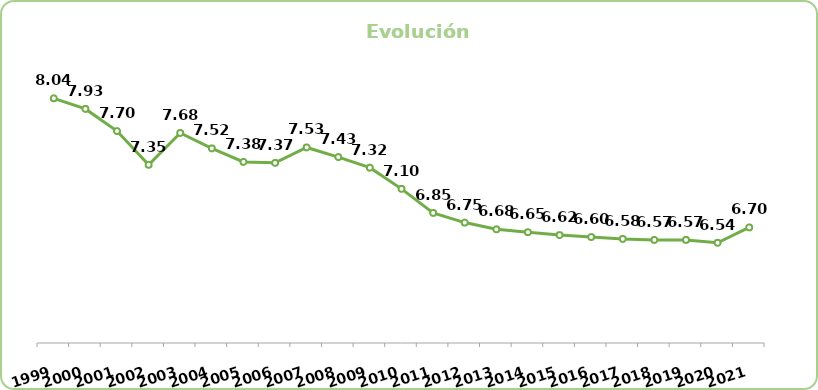
| Category | Series 0 |
|---|---|
| 1999.0 | 8.04 |
| 2000.0 | 7.93 |
| 2001.0 | 7.7 |
| 2002.0 | 7.35 |
| 2003.0 | 7.68 |
| 2004.0 | 7.52 |
| 2005.0 | 7.38 |
| 2006.0 | 7.37 |
| 2007.0 | 7.53 |
| 2008.0 | 7.43 |
| 2009.0 | 7.32 |
| 2010.0 | 7.1 |
| 2011.0 | 6.85 |
| 2012.0 | 6.75 |
| 2013.0 | 6.68 |
| 2014.0 | 6.65 |
| 2015.0 | 6.62 |
| 2016.0 | 6.6 |
| 2017.0 | 6.58 |
| 2018.0 | 6.57 |
| 2019.0 | 6.57 |
| 2020.0 | 6.54 |
| 2021.0 | 6.7 |